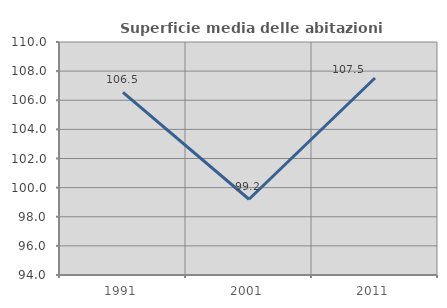
| Category | Superficie media delle abitazioni occupate |
|---|---|
| 1991.0 | 106.543 |
| 2001.0 | 99.201 |
| 2011.0 | 107.529 |